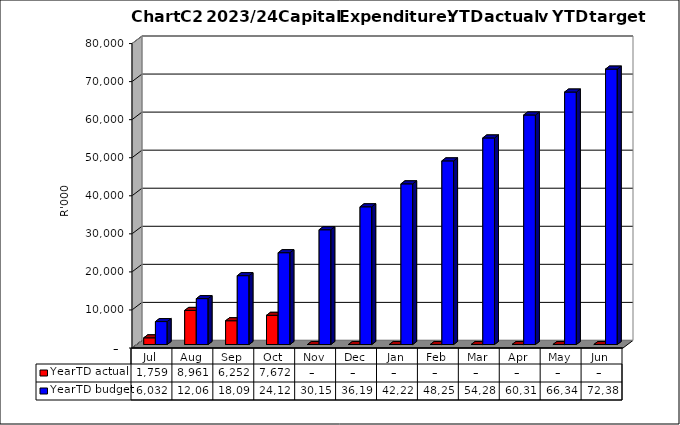
| Category | YearTD actual | YearTD budget |
|---|---|---|
| Jul | 1759374.9 | 6031706 |
| Aug | 8961182.31 | 12063412 |
| Sep | 6251636.02 | 18095118 |
| Oct | 7671938.68 | 24126824 |
| Nov | 0 | 30158530 |
| Dec | 0 | 36190236 |
| Jan | 0 | 42221942 |
| Feb | 0 | 48253648 |
| Mar | 0 | 54285354 |
| Apr | 0 | 60317060 |
| May | 0 | 66348766 |
| Jun | 0 | 72380350 |